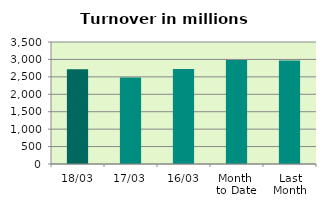
| Category | Series 0 |
|---|---|
| 18/03 | 2719.595 |
| 17/03 | 2478.086 |
| 16/03 | 2726.996 |
| Month 
to Date | 2984.381 |
| Last
Month | 2972.107 |